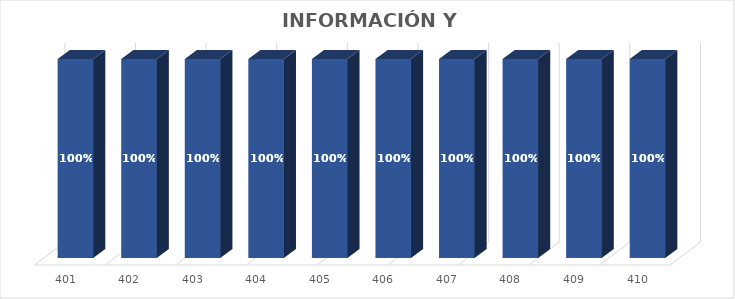
| Category | % Avance |
|---|---|
| 401.0 | 1 |
| 402.0 | 1 |
| 403.0 | 1 |
| 404.0 | 1 |
| 405.0 | 1 |
| 406.0 | 1 |
| 407.0 | 1 |
| 408.0 | 1 |
| 409.0 | 1 |
| 410.0 | 1 |